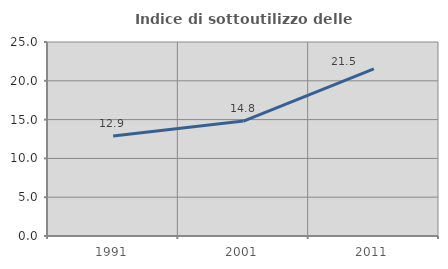
| Category | Indice di sottoutilizzo delle abitazioni  |
|---|---|
| 1991.0 | 12.881 |
| 2001.0 | 14.815 |
| 2011.0 | 21.549 |